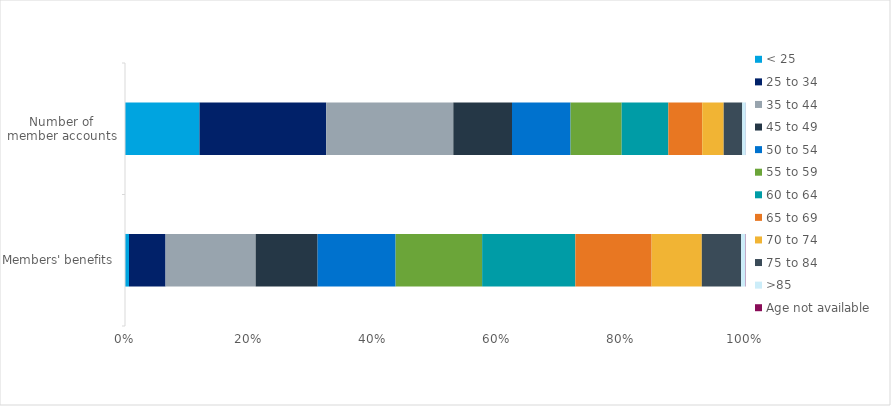
| Category | < 25 | 25 to 34 | 35 to 44 | 45 to 49 | 50 to 54 | 55 to 59 | 60 to 64 | 65 to 69 | 70 to 74 | 75 to 84 | >85 | Age not available |
|---|---|---|---|---|---|---|---|---|---|---|---|---|
| Members' benefits | 0.006 | 0.059 | 0.145 | 0.1 | 0.126 | 0.139 | 0.15 | 0.123 | 0.081 | 0.063 | 0.007 | 0 |
| Number of member accounts | 0.12 | 0.204 | 0.205 | 0.095 | 0.094 | 0.082 | 0.075 | 0.055 | 0.035 | 0.03 | 0.006 | 0 |